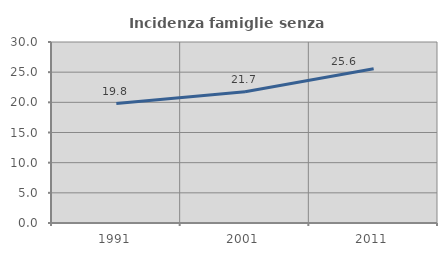
| Category | Incidenza famiglie senza nuclei |
|---|---|
| 1991.0 | 19.796 |
| 2001.0 | 21.743 |
| 2011.0 | 25.56 |